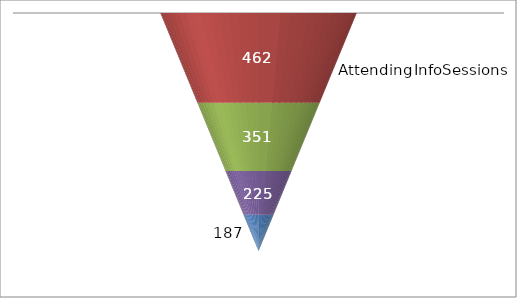
| Category | Series 1 | Series 2 | Series 3 | Series 0 |
|---|---|---|---|---|
| 0 | 462 | 351 | 225 | 187 |